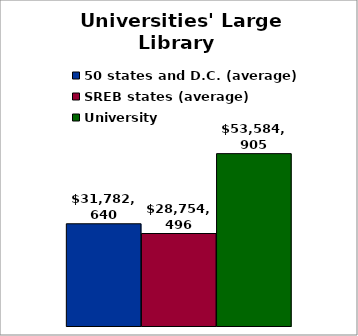
| Category | 50 states and D.C. (average) | SREB states (average) | University |
|---|---|---|---|
| 0 | 31782639.707 | 28754496.367 | 53584905 |